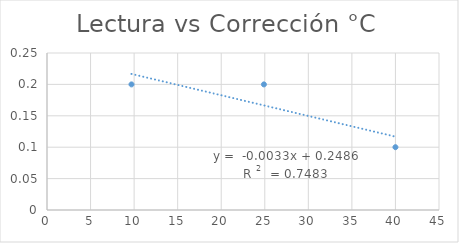
| Category | Series 0 |
|---|---|
| 9.7 | 0.2 |
| 24.9 | 0.2 |
| 40.0 | 0.1 |